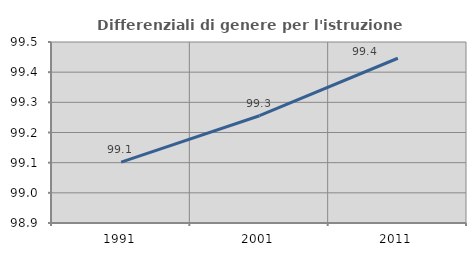
| Category | Differenziali di genere per l'istruzione superiore |
|---|---|
| 1991.0 | 99.102 |
| 2001.0 | 99.256 |
| 2011.0 | 99.446 |